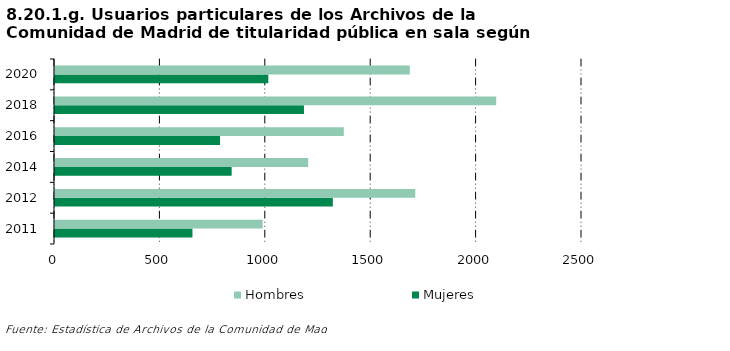
| Category | Mujeres | Hombres |
|---|---|---|
| 2011.0 | 652 | 985 |
| 2012.0 | 1318 | 1709 |
| 2014.0 | 838 | 1201 |
| 2016.0 | 783 | 1370 |
| 2018.0 | 1181 | 2093 |
| 2020.0 | 1012 | 1683 |